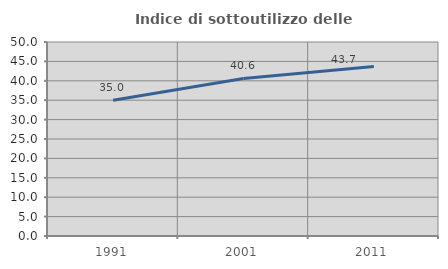
| Category | Indice di sottoutilizzo delle abitazioni  |
|---|---|
| 1991.0 | 34.962 |
| 2001.0 | 40.595 |
| 2011.0 | 43.71 |